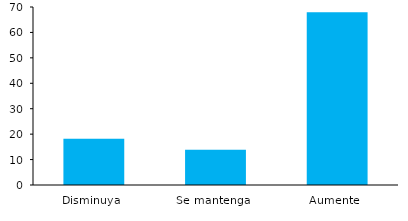
| Category | Series 0 |
|---|---|
| Disminuya | 18.2 |
| Se mantenga | 13.9 |
| Aumente | 67.9 |